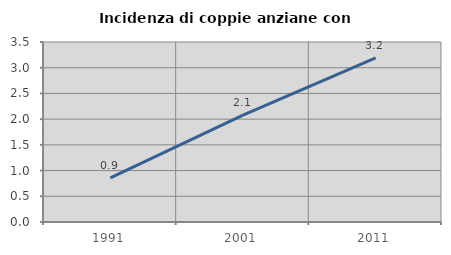
| Category | Incidenza di coppie anziane con figli |
|---|---|
| 1991.0 | 0.857 |
| 2001.0 | 2.077 |
| 2011.0 | 3.191 |